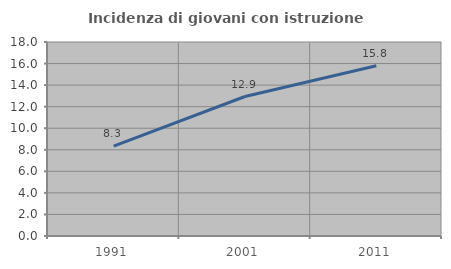
| Category | Incidenza di giovani con istruzione universitaria |
|---|---|
| 1991.0 | 8.333 |
| 2001.0 | 12.941 |
| 2011.0 | 15.789 |